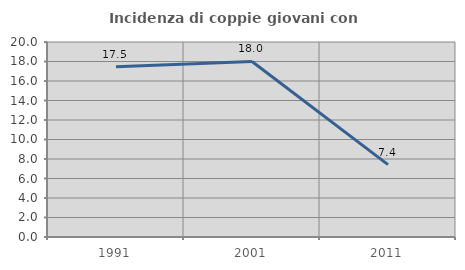
| Category | Incidenza di coppie giovani con figli |
|---|---|
| 1991.0 | 17.469 |
| 2001.0 | 18.006 |
| 2011.0 | 7.429 |